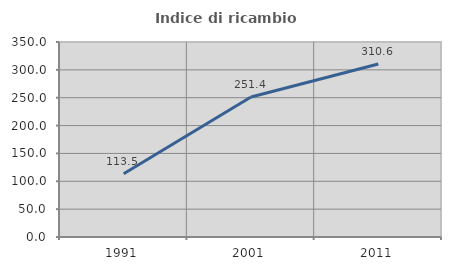
| Category | Indice di ricambio occupazionale  |
|---|---|
| 1991.0 | 113.525 |
| 2001.0 | 251.351 |
| 2011.0 | 310.556 |